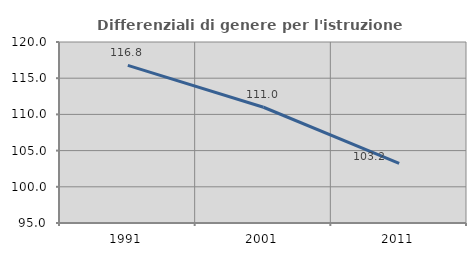
| Category | Differenziali di genere per l'istruzione superiore |
|---|---|
| 1991.0 | 116.765 |
| 2001.0 | 110.987 |
| 2011.0 | 103.241 |